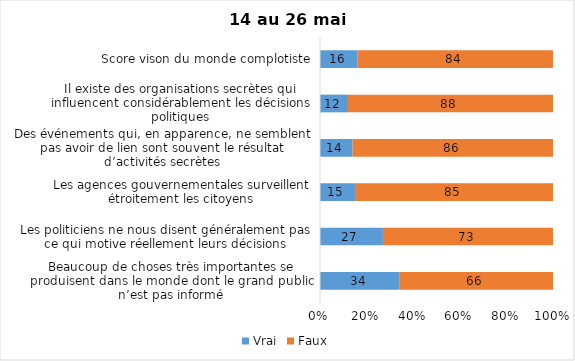
| Category | Vrai | Faux |
|---|---|---|
| Beaucoup de choses très importantes se produisent dans le monde dont le grand public n’est pas informé | 34 | 66 |
| Les politiciens ne nous disent généralement pas ce qui motive réellement leurs décisions | 27 | 73 |
| Les agences gouvernementales surveillent étroitement les citoyens | 15 | 85 |
| Des événements qui, en apparence, ne semblent pas avoir de lien sont souvent le résultat d’activités secrètes | 14 | 86 |
| Il existe des organisations secrètes qui influencent considérablement les décisions politiques | 12 | 88 |
| Score vison du monde complotiste | 16 | 84 |